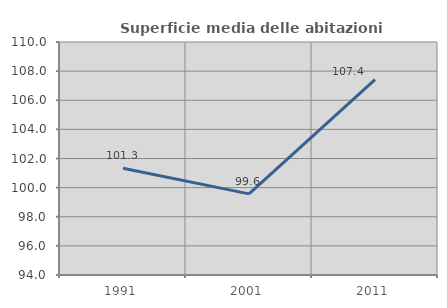
| Category | Superficie media delle abitazioni occupate |
|---|---|
| 1991.0 | 101.328 |
| 2001.0 | 99.572 |
| 2011.0 | 107.415 |